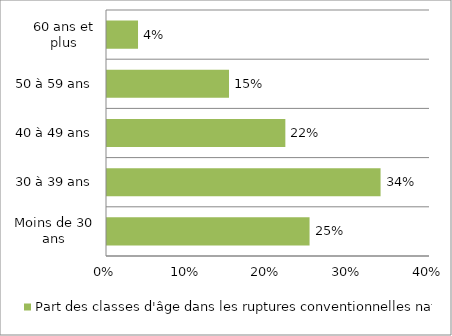
| Category | Part des classes d'âge dans les ruptures conventionnelles nationales  en 2019 |
|---|---|
| Moins de 30 ans | 0.251 |
| 30 à 39 ans | 0.339 |
| 40 à 49 ans | 0.221 |
| 50 à 59 ans | 0.151 |
| 60 ans et plus | 0.038 |